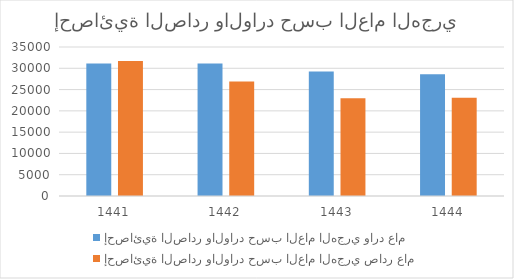
| Category | إحصائية الصادر والوارد حسب العام الهجري |
|---|---|
| 1441.0 | 31716 |
| 1442.0 | 26885 |
| 1443.0 | 22942 |
| 1444.0 | 23053 |